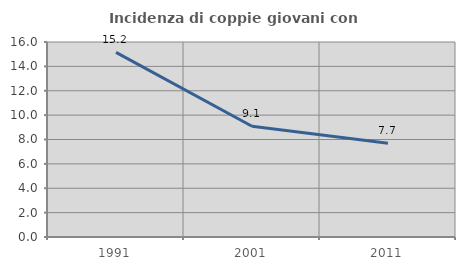
| Category | Incidenza di coppie giovani con figli |
|---|---|
| 1991.0 | 15.152 |
| 2001.0 | 9.091 |
| 2011.0 | 7.692 |